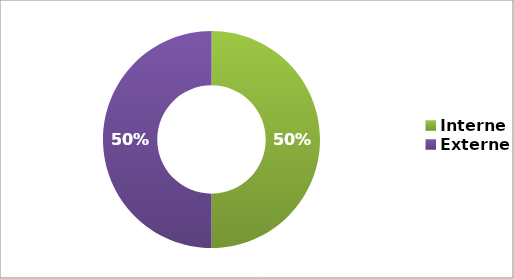
| Category | Series 0 |
|---|---|
| Interne | 0.5 |
| Externe | 0.5 |